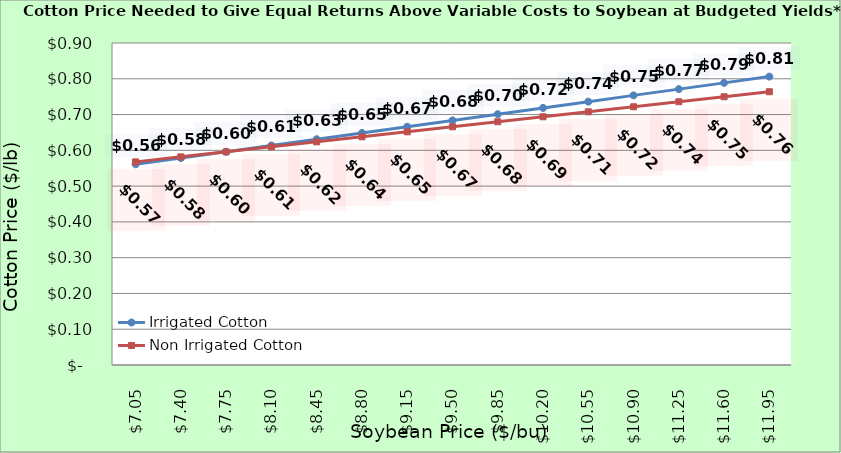
| Category | Irrigated Cotton | Non Irrigated Cotton |
|---|---|---|
| 7.0500000000000025 | 0.561 | 0.568 |
| 7.400000000000002 | 0.579 | 0.582 |
| 7.750000000000002 | 0.596 | 0.596 |
| 8.100000000000001 | 0.614 | 0.61 |
| 8.450000000000001 | 0.631 | 0.624 |
| 8.8 | 0.649 | 0.638 |
| 9.15 | 0.666 | 0.652 |
| 9.5 | 0.684 | 0.666 |
| 9.85 | 0.701 | 0.68 |
| 10.2 | 0.719 | 0.694 |
| 10.549999999999999 | 0.736 | 0.708 |
| 10.899999999999999 | 0.754 | 0.722 |
| 11.249999999999998 | 0.771 | 0.736 |
| 11.599999999999998 | 0.789 | 0.75 |
| 11.949999999999998 | 0.806 | 0.764 |